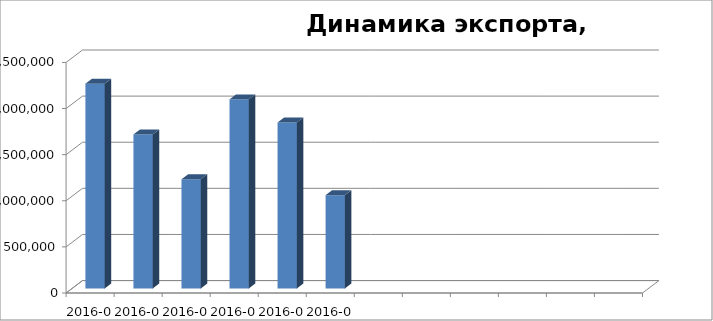
| Category | Стоимость, USD |
|---|---|
| 2016-01 | 2220508.3 |
| 2016-02 | 1670332.68 |
| 2016-03 | 1184087.45 |
| 2016-04 | 2050731.68 |
| 2016-05 | 1799906.32 |
| 2016-06 | 1012240.22 |